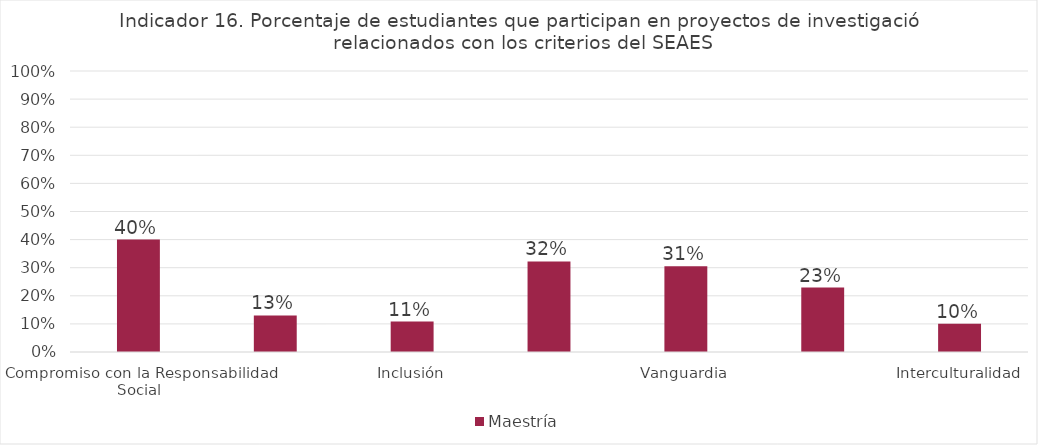
| Category | Maestría |
|---|---|
| Compromiso con la Responsabilidad Social | 0.4 |
| Equidad Social y de Género | 0.13 |
| Inclusión | 0.108 |
| Excelencia | 0.322 |
| Vanguardia | 0.306 |
| Innovación Social | 0.229 |
| Interculturalidad | 0.1 |